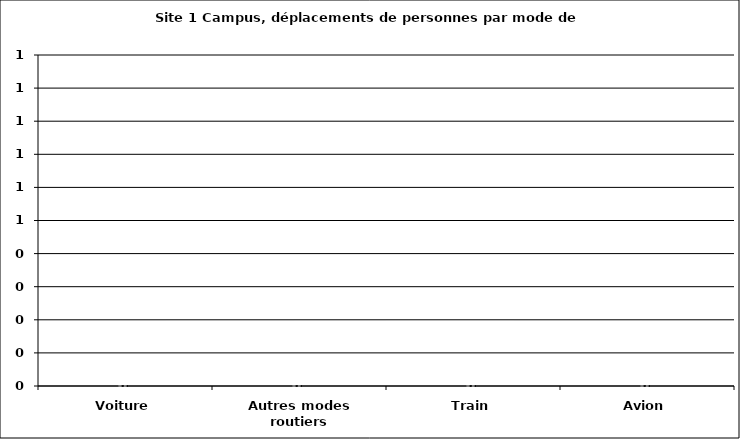
| Category | Mode de transport |
|---|---|
| Voiture | 0 |
| Autres modes routiers | 0 |
| Train | 0 |
| Avion | 0 |